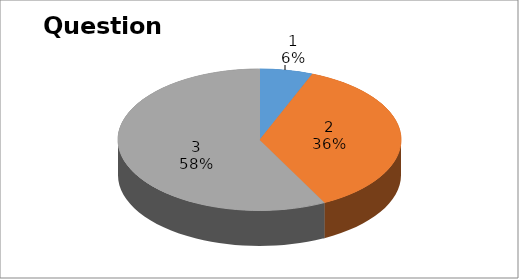
| Category | Series 0 |
|---|---|
| 0 | 2 |
| 1 | 12 |
| 2 | 19 |